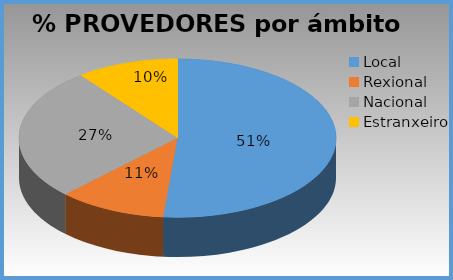
| Category | % provedores |
|---|---|
| Local | 0.514 |
| Rexional | 0.11 |
| Nacional | 0.271 |
| Estranxeiro | 0.104 |